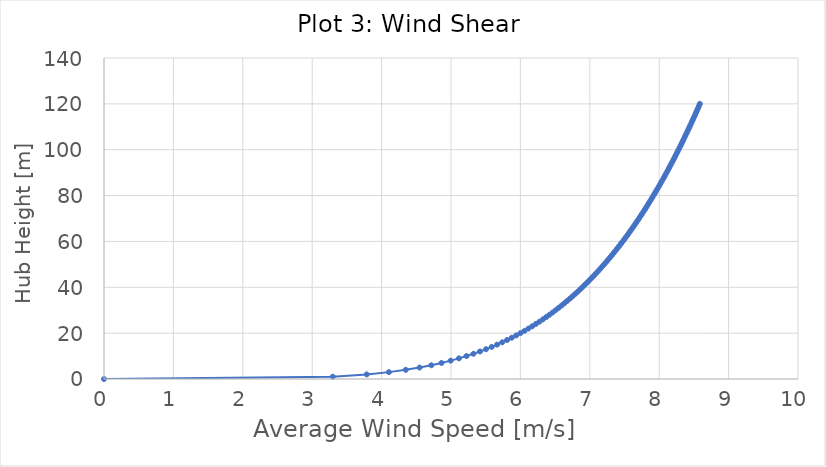
| Category | Series 0 |
|---|---|
| 0.0 | 0 |
| 3.2956816299183536 | 1 |
| 3.7857440668811595 | 2 |
| 4.10553257351179 | 3 |
| 4.348677982066173 | 4 |
| 4.547149699531195 | 5 |
| 4.716018513579737 | 6 |
| 4.8636784985936945 | 7 |
| 4.995319244411238 | 8 |
| 5.1143889504229545 | 9 |
| 5.223303379776745 | 10 |
| 5.323825208197956 | 11 |
| 5.417282708684605 | 12 |
| 5.504703375662988 | 13 |
| 5.586899490569026 | 14 |
| 5.664525067769412 | 15 |
| 5.7381149987402225 | 16 |
| 5.808112710014888 | 17 |
| 5.874890174165861 | 18 |
| 5.938762690121931 | 19 |
| 6.0 | 20 |
| 6.0588347860409115 | 21 |
| 6.115469258948739 | 22 |
| 6.170080332601282 | 23 |
| 6.222823736019889 | 24 |
| 6.273837315547639 | 25 |
| 6.323243712370701 | 26 |
| 6.371152552769608 | 27 |
| 6.417662254350413 | 28 |
| 6.462861526756459 | 29 |
| 6.506830627186192 | 30 |
| 6.549642417535731 | 31 |
| 6.591363259836707 | 32 |
| 6.632053778957216 | 33 |
| 6.671769515631473 | 34 |
| 6.710561488320868 | 35 |
| 6.748476678852569 | 36 |
| 6.785558453987758 | 37 |
| 6.821846932860828 | 38 |
| 6.857379308469365 | 39 |
| 6.892190129982211 | 40 |
| 6.926311551493286 | 41 |
| 6.959773551924007 | 42 |
| 6.992604130022553 | 43 |
| 7.024829477789353 | 44 |
| 7.056474135148042 | 45 |
| 7.087561128258651 | 46 |
| 7.1181120935184925 | 47 |
| 7.148147389002549 | 48 |
| 7.177686194849062 | 49 |
| 7.206746603888588 | 50 |
| 7.235345703639676 | 51 |
| 7.263499650645568 | 52 |
| 7.291223737999941 | 53 |
| 7.318532456801608 | 54 |
| 7.345439552185647 | 55 |
| 7.371958074498883 | 56 |
| 7.3981004261191705 | 57 |
| 7.42387840435877 | 58 |
| 7.449303240840782 | 59 |
| 7.474385637693104 | 60 |
| 7.4991358008655755 | 61 |
| 7.523563470842097 | 62 |
| 7.547677950989927 | 63 |
| 7.571488133762319 | 64 |
| 7.595002524947901 | 65 |
| 7.618229266140025 | 66 |
| 7.641176155581599 | 67 |
| 7.663850667525239 | 68 |
| 7.686259970234618 | 69 |
| 7.708410942740636 | 70 |
| 7.73031019045496 | 71 |
| 7.751964059733799 | 72 |
| 7.773378651476035 | 73 |
| 7.794559833831961 | 74 |
| 7.815513254092057 | 75 |
| 7.836244349818803 | 76 |
| 7.8567583592790715 | 77 |
| 7.877060331229465 | 78 |
| 7.897155134102491 | 79 |
| 7.917047464637365 | 80 |
| 7.936741855995485 | 81 |
| 7.956242685397299 | 82 |
| 7.975554181314291 | 83 |
| 7.99468043024698 | 84 |
| 8.013625383117422 | 85 |
| 8.03239286130238 | 86 |
| 8.0509865623313 | 87 |
| 8.069410065271313 | 88 |
| 8.087666835819828 | 89 |
| 8.105760231123682 | 90 |
| 8.123693504342372 | 91 |
| 8.141469808971642 | 92 |
| 8.159092202942436 | 93 |
| 8.176563652509191 | 94 |
| 8.193887035940424 | 95 |
| 8.21106514702358 | 96 |
| 8.228100698395382 | 97 |
| 8.244996324708044 | 98 |
| 8.261754585641018 | 99 |
| 8.27837796876729 | 100 |
| 8.294868892282654 | 101 |
| 8.31122970760576 | 102 |
| 8.327462701856295 | 103 |
| 8.343570100218104 | 104 |
| 8.35955406819366 | 105 |
| 8.375416713755865 | 106 |
| 8.391160089402764 | 107 |
| 8.406786194120416 | 108 |
| 8.422296975258874 | 109 |
| 8.437694330325812 | 110 |
| 8.452980108702185 | 111 |
| 8.468156113283976 | 112 |
| 8.48322410205379 | 113 |
| 8.498185789585955 | 114 |
| 8.513042848488466 | 115 |
| 8.527796910784932 | 116 |
| 8.542449569239547 | 117 |
| 8.557002378627887 | 118 |
| 8.571456856956173 | 119 |
| 8.585814486631534 | 120 |